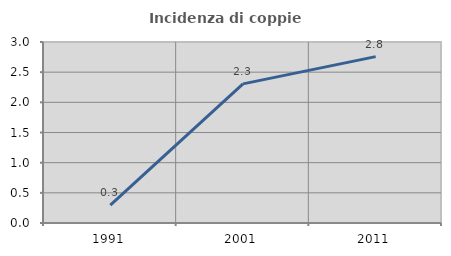
| Category | Incidenza di coppie miste |
|---|---|
| 1991.0 | 0.298 |
| 2001.0 | 2.305 |
| 2011.0 | 2.758 |